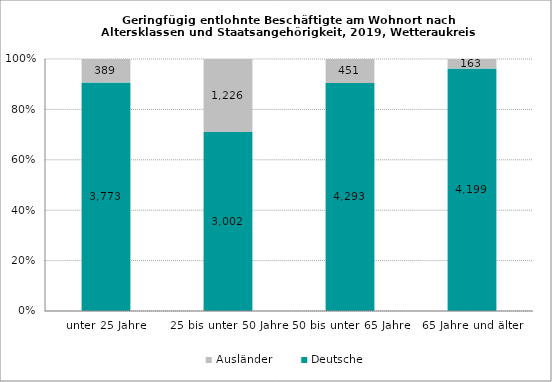
| Category | Deutsche | Ausländer |
|---|---|---|
| unter 25 Jahre | 3773 | 389 |
| 25 bis unter 50 Jahre | 3002 | 1226 |
| 50 bis unter 65 Jahre | 4293 | 451 |
| 65 Jahre und älter | 4199 | 163 |